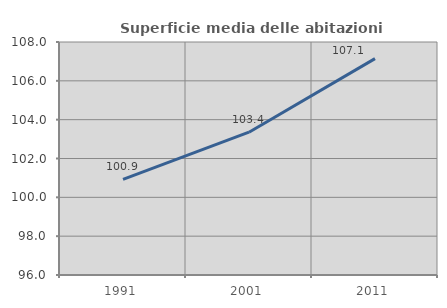
| Category | Superficie media delle abitazioni occupate |
|---|---|
| 1991.0 | 100.922 |
| 2001.0 | 103.355 |
| 2011.0 | 107.146 |